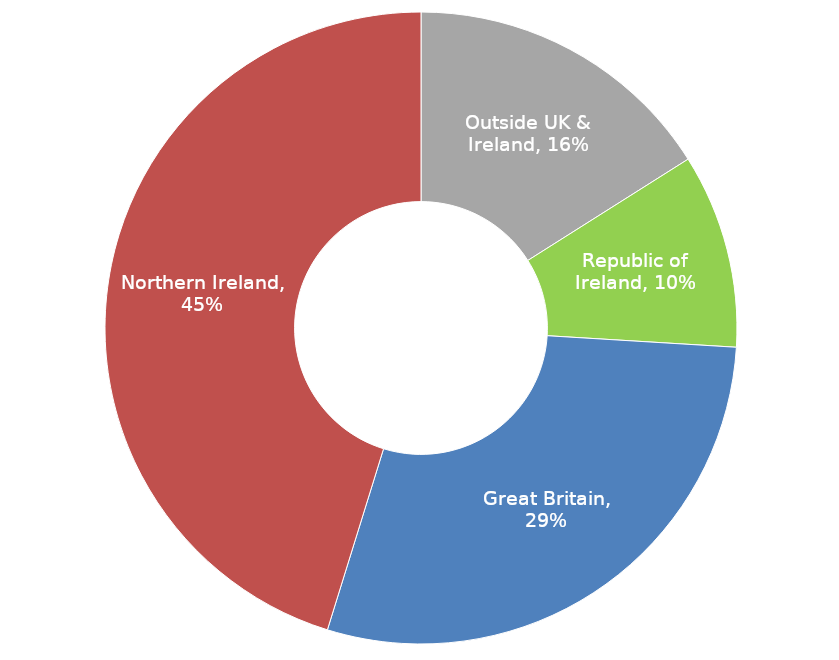
| Category | Series 0 |
|---|---|
| Outside UK & Ireland | 0.16 |
| Republic of Ireland | 0.099 |
| Great Britain | 0.288 |
| Northern Ireland | 0.452 |